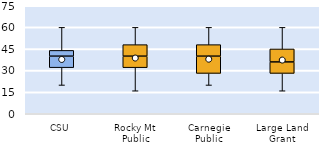
| Category | 25th | 50th | 75th |
|---|---|---|---|
| CSU | 32 | 8 | 4 |
| Rocky Mt Public | 32 | 8 | 8 |
| Carnegie Public | 28 | 12 | 8 |
| Large Land Grant | 28 | 8 | 9 |